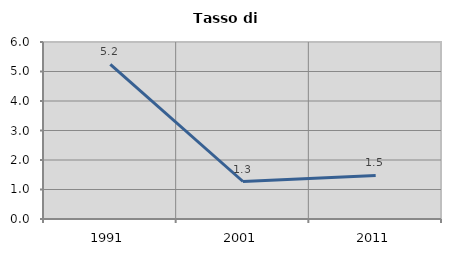
| Category | Tasso di disoccupazione   |
|---|---|
| 1991.0 | 5.242 |
| 2001.0 | 1.271 |
| 2011.0 | 1.476 |